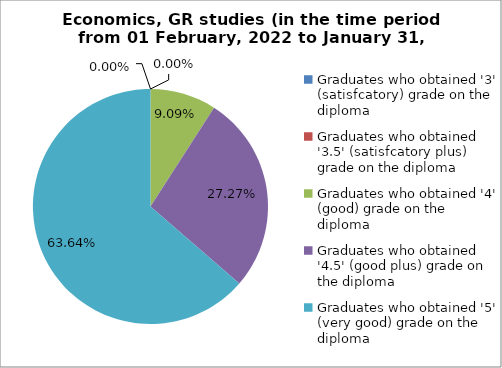
| Category | Series 0 |
|---|---|
| Graduates who obtained '3' (satisfcatory) grade on the diploma  | 0 |
| Graduates who obtained '3.5' (satisfcatory plus) grade on the diploma  | 0 |
| Graduates who obtained '4' (good) grade on the diploma  | 9.091 |
| Graduates who obtained '4.5' (good plus) grade on the diploma  | 27.273 |
| Graduates who obtained '5' (very good) grade on the diploma  | 63.636 |